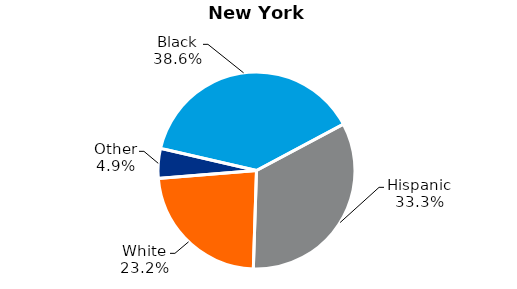
| Category | Series 0 |
|---|---|
| Black | 38.6 |
| Hispanic | 33.3 |
| White | 23.2 |
| Other | 4.9 |